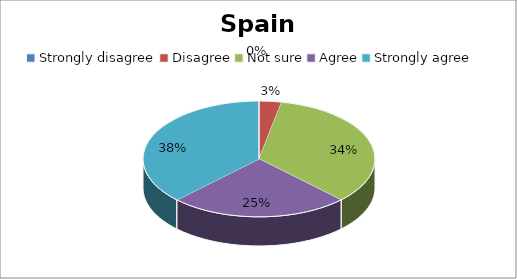
| Category | Series 0 |
|---|---|
| Strongly disagree | 0 |
| Disagree | 1 |
| Not sure | 11 |
| Agree | 8 |
| Strongly agree | 12 |